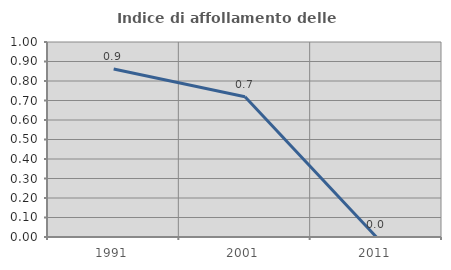
| Category | Indice di affollamento delle abitazioni  |
|---|---|
| 1991.0 | 0.861 |
| 2001.0 | 0.719 |
| 2011.0 | 0 |